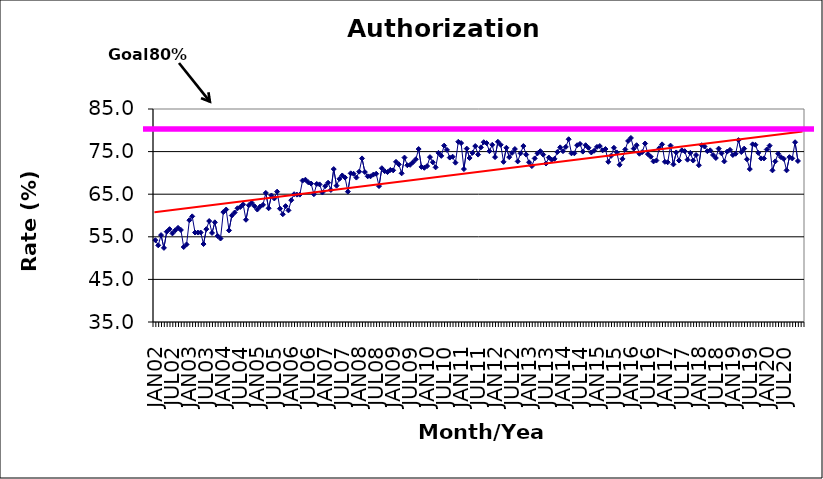
| Category | Series 0 |
|---|---|
| JAN02 | 54.2 |
| FEB02 | 53 |
| MAR02 | 55.4 |
| APR02 | 52.4 |
| MAY02 | 56.2 |
| JUN02 | 56.8 |
| JUL02 | 55.8 |
| AUG02 | 56.5 |
| SEP02 | 57.1 |
| OCT02 | 56.6 |
| NOV02 | 52.6 |
| DEC02 | 53.2 |
| JAN03 | 58.9 |
| FEB03 | 59.8 |
| MAR03 | 56 |
| APR03 | 56 |
| MAY03 | 56 |
| JUN03 | 53.3 |
| JUL03 | 56.8 |
| AUG03 | 58.7 |
| SEP03 | 55.9 |
| OCT03 | 58.4 |
| NOV03 | 55.2 |
| DEC03 | 54.6 |
| JAN04 | 60.8 |
| FEB04 | 61.4 |
| MAR04 | 56.5 |
| APR04 | 60 |
| MAY04 | 60.7 |
| JUN04 | 61.7 |
| JUL04 | 62 |
| AUG04 | 62.6 |
| SEP04 | 59 |
| OCT04 | 62.4 |
| NOV04 | 63 |
| DEC04 | 62.2 |
| JAN05 | 61.4 |
| FEB05 | 62.1 |
| MAR05 | 62.5 |
| APR05 | 65.3 |
| MAY05 | 61.7 |
| JUN05 | 64.7 |
| JUL05 | 64 |
| AUG05 | 65.6 |
| SEP05 | 61.6 |
| OCT05 | 60.3 |
| NOV05 | 62.2 |
| DEC05 | 61.2 |
| JAN06 | 63.6 |
| FEB06 | 65 |
| MAR06 | 64.9 |
| APR06 | 64.9 |
| MAY06 | 68.2 |
| JUN06 | 68.4 |
| JUL06 | 67.8 |
| AUG06 | 67.5 |
| SEP06 | 65 |
| OCT06 | 67.4 |
| NOV06 | 67.3 |
| DEC06 | 65.4 |
| JAN07 | 66.9 |
| FEB07 | 67.7 |
| MAR07 | 66 |
| APR07 | 70.9 |
| MAY07 | 67 |
| JUN07 | 68.6 |
| JUL07 | 69.4 |
| AUG07 | 68.9 |
| SEP07 | 65.6 |
| OCT07 | 69.9 |
| NOV07 | 69.8 |
| DEC07 | 68.9 |
| JAN08 | 70.3 |
| FEB08 | 73.4 |
| MAR08 | 70.2 |
| APR08 | 69.2 |
| MAY08 | 69.2 |
| JUN08 | 69.6 |
| JUL08 | 69.8 |
| AUG08 | 66.9 |
| SEP08 | 71.1 |
| OCT08 | 70.4 |
| NOV08 | 70.2 |
| DEC08 | 70.7 |
| JAN09 | 70.6 |
| FEB09 | 72.6 |
| MAR09 | 72 |
| APR09 | 69.9 |
| MAY09 | 73.6 |
| JUN09 | 71.8 |
| JUL09 | 71.9 |
| AUG09 | 72.5 |
| SEP09 | 73.2 |
| OCT09 | 75.6 |
| NOV09 | 71.4 |
| DEC09 | 71.2 |
| JAN10 | 71.6 |
| FEB10 | 73.7 |
| MAR10 | 72.5 |
| APR10 | 71.3 |
| MAY10 | 74.7 |
| JUN10 | 74 |
| JUL10 | 76.4 |
| AUG10 | 75.4 |
| SEP10 | 73.6 |
| OCT10 | 73.8 |
| NOV10 | 72.4 |
| DEC10 | 77.3 |
| JAN11 | 77 |
| FEB11 | 70.9 |
| MAR11 | 75.7 |
| APR11 | 73.5 |
| MAY11 | 74.7 |
| JUN11 | 76.3 |
| JUL11 | 74.3 |
| AUG11 | 76 |
| SEP11 | 77.2 |
| OCT11 | 77 |
| NOV11 | 75.1 |
| DEC11 | 76.6 |
| JAN12 | 73.7 |
| FEB12 | 77.3 |
| MAR12 | 76.6 |
| APR12 | 72.6 |
| MAY12 | 75.9 |
| JUN12 | 73.7 |
| JUL12 | 74.7 |
| AUG12 | 75.6 |
| SEP12 | 72.7 |
| OCT12 | 74.6 |
| NOV12 | 76.3 |
| DEC12 | 74.3 |
| JAN13 | 72.5 |
| FEB13 | 71.6 |
| MAR13 | 73.4 |
| APR13 | 74.6 |
| MAY13 | 75.1 |
| JUN13 | 74.3 |
| JUL13 | 72.2 |
| AUG13 | 73.6 |
| SEP13 | 73.1 |
| OCT13 | 73.3 |
| NOV13 | 74.9 |
| DEC13 | 76 |
| JAN14 | 75.1 |
| FEB14 | 76.1 |
| MAR14 | 77.9 |
| APR14 | 74.6 |
| MAY14 | 74.6 |
| JUN14 | 76.5 |
| JUL14 | 76.8 |
| AUG14 | 75 |
| SEP14 | 76.5 |
| OCT14 | 75.9 |
| NOV14 | 74.8 |
| DEC14 | 75.2 |
| JAN15 | 76.1 |
| FEB15 | 76.3 |
| MAR15 | 75.3 |
| APR15 | 75.6 |
| MAY15 | 72.6 |
| JUN15 | 74 |
| JUL15 | 75.9 |
| AUG15 | 74.8 |
| SEP15 | 71.9 |
| OCT15 | 73.3 |
| NOV15 | 75.5 |
| DEC15 | 77.5 |
| JAN16 | 78.2 |
| FEB16 | 75.7 |
| MAR16 | 76.5 |
| APR16 | 74.5 |
| MAY16 | 74.9 |
| JUN16 | 76.9 |
| JUL16 | 74.4 |
| AUG16 | 73.8 |
| SEP16 | 72.7 |
| OCT16 | 72.9 |
| NOV16 | 75.8 |
| DEC16 | 76.7 |
| JAN17 | 72.6 |
| FEB17 | 72.5 |
| MAR17 | 76.4 |
| APR17 | 72 |
| MAY17 | 74.8 |
| JUN17 | 72.9 |
| JUL17 | 75.3 |
| AUG17 | 75.1 |
| SEP17 | 73.1 |
| OCT17 | 74.7 |
| NOV17 | 72.9 |
| DEC17 | 74.2 |
| JAN18 | 71.8 |
| FEB18 | 76.5 |
| MAR18 | 76.2 |
| APR18 | 75.1 |
| MAY18 | 75.3 |
| JUN18 | 74.2 |
| JUL18 | 73.5 |
| AUG18 | 75.7 |
| SEP18 | 74.6 |
| OCT18 | 72.7 |
| NOV18 | 75 |
| DEC18 | 75.4 |
| JAN19 | 74.2 |
| FEB19 | 74.5 |
| MAR19 | 77.7 |
| APR19 | 74.9 |
| MAY19 | 75.7 |
| JUN19 | 73.2 |
| JUL19 | 70.9 |
| AUG19 | 76.7 |
| SEP19 | 76.6 |
| OCT19 | 74.7 |
| NOV19 | 73.4 |
| DEC19 | 73.4 |
| JAN20 | 75.5 |
| FEB20 | 76.4 |
| MAR20 | 70.6 |
| APR20 | 72.7 |
| MAY20 | 74.5 |
| JUN20 | 73.7 |
| JUL20 | 73.3 |
| AUG20 | 70.6 |
| SEP20 | 73.7 |
| OCT20 | 73.4 |
| NOV20 | 77.2 |
| DEC20 | 72.8 |